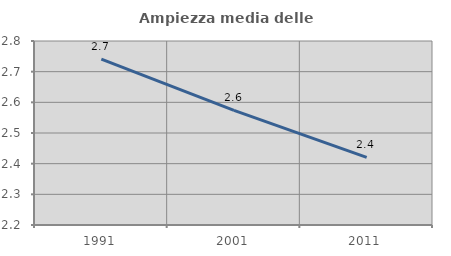
| Category | Ampiezza media delle famiglie |
|---|---|
| 1991.0 | 2.741 |
| 2001.0 | 2.574 |
| 2011.0 | 2.421 |